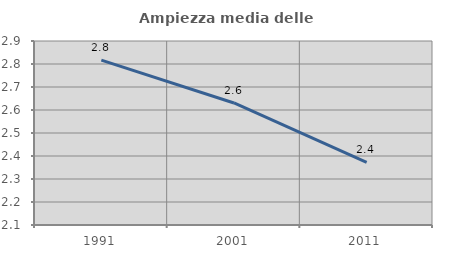
| Category | Ampiezza media delle famiglie |
|---|---|
| 1991.0 | 2.817 |
| 2001.0 | 2.631 |
| 2011.0 | 2.372 |